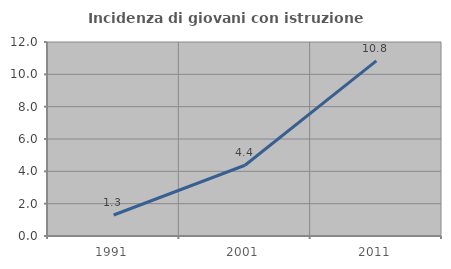
| Category | Incidenza di giovani con istruzione universitaria |
|---|---|
| 1991.0 | 1.299 |
| 2001.0 | 4.375 |
| 2011.0 | 10.833 |